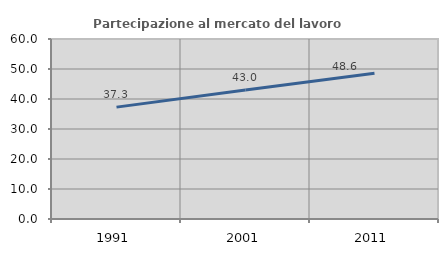
| Category | Partecipazione al mercato del lavoro  femminile |
|---|---|
| 1991.0 | 37.289 |
| 2001.0 | 42.974 |
| 2011.0 | 48.566 |